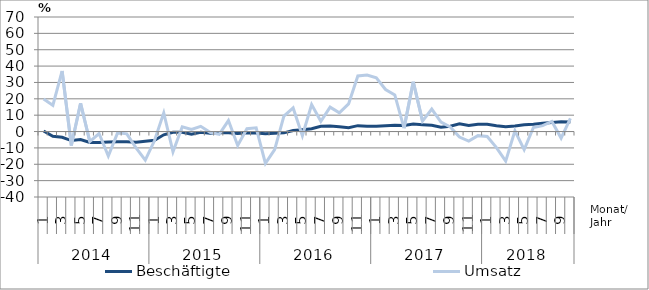
| Category | Beschäftigte | Umsatz |
|---|---|---|
| 0 | 0.3 | 19.9 |
| 1 | -2.9 | 16 |
| 2 | -3.5 | 37 |
| 3 | -5.5 | -8.5 |
| 4 | -4.9 | 17.3 |
| 5 | -6.7 | -6.1 |
| 6 | -6.7 | -1.2 |
| 7 | -6.4 | -15 |
| 8 | -6.2 | -0.8 |
| 9 | -6.2 | -1.4 |
| 10 | -6.6 | -10 |
| 11 | -5.9 | -17.5 |
| 12 | -5.3 | -5.5 |
| 13 | -2 | 11.4 |
| 14 | -0.5 | -12.4 |
| 15 | -0.5 | 2.9 |
| 16 | -1.7 | 1.3 |
| 17 | -0.5 | 3.2 |
| 18 | -1.1 | -0.5 |
| 19 | -0.8 | -1.7 |
| 20 | -0.7 | 6.7 |
| 21 | -1.2 | -8.5 |
| 22 | -0.7 | 1.7 |
| 23 | -0.9 | 2.3 |
| 24 | -1.3 | -19.4 |
| 25 | -1.1 | -11 |
| 26 | -0.8 | 9.4 |
| 27 | 0.6 | 14.4 |
| 28 | 1.1 | -2.6 |
| 29 | 1.7 | 16.5 |
| 30 | 3.2 | 6.3 |
| 31 | 3.4 | 14.9 |
| 32 | 3 | 11.4 |
| 33 | 2.4 | 16.9 |
| 34 | 3.6 | 34 |
| 35 | 3.2 | 34.5 |
| 36 | 3.3 | 32.8 |
| 37 | 3.6 | 25.7 |
| 38 | 3.9 | 22.4 |
| 39 | 3.7 | 2.1 |
| 40 | 4.6 | 30.4 |
| 41 | 4.2 | 6.4 |
| 42 | 3.8 | 13.7 |
| 43 | 2.7 | 5.8 |
| 44 | 3.3 | 2.8 |
| 45 | 4.7 | -3.4 |
| 46 | 3.7 | -5.8 |
| 47 | 4.4 | -2.5 |
| 48 | 4.5 | -3 |
| 49 | 3.6 | -9.8 |
| 50 | 2.9 | -18.1 |
| 51 | 3.4 | 0.5 |
| 52 | 4.2 | -11 |
| 53 | 4.5 | 2.5 |
| 54 | 5.1 | 3.6 |
| 55 | 5.5 | 6.2 |
| 56 | 6 | -4 |
| 57 | 5.8 | 8 |